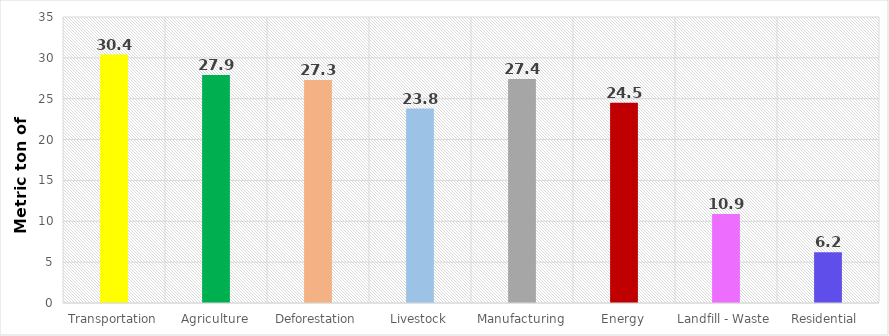
| Category | 2012 |
|---|---|
| Transportation | 30.4 |
| Agriculture | 27.9 |
| Deforestation | 27.3 |
| Livestock | 23.8 |
| Manufacturing | 27.4 |
| Energy | 24.5 |
| Landfill - Waste | 10.9 |
| Residential  | 6.2 |